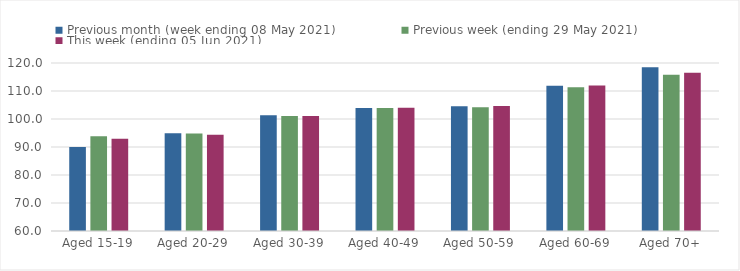
| Category | Previous month (week ending 08 May 2021) | Previous week (ending 29 May 2021) | This week (ending 05 Jun 2021) |
|---|---|---|---|
| Aged 15-19 | 90.04 | 93.83 | 92.95 |
| Aged 20-29 | 94.89 | 94.86 | 94.36 |
| Aged 30-39 | 101.34 | 101.05 | 101.05 |
| Aged 40-49 | 103.93 | 103.89 | 103.98 |
| Aged 50-59 | 104.51 | 104.24 | 104.67 |
| Aged 60-69 | 111.86 | 111.38 | 111.98 |
| Aged 70+ | 118.49 | 115.78 | 116.54 |